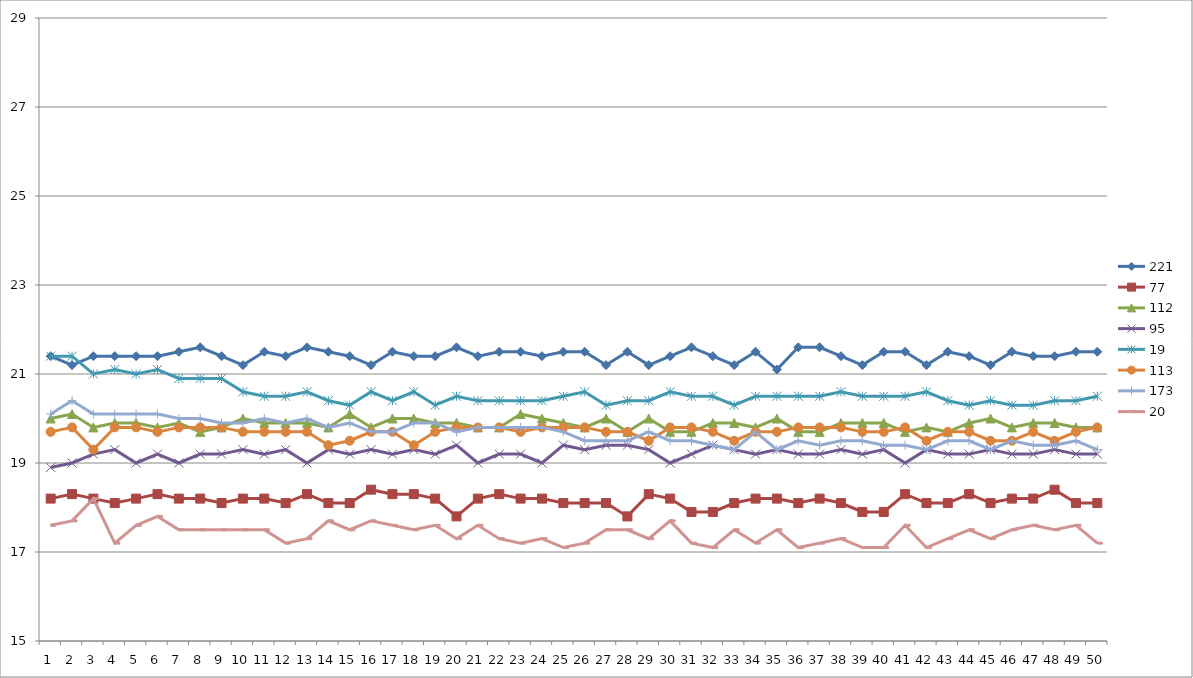
| Category | 221 | 77 | 112 | 95 | 19 | 113 | 173 | 20 |
|---|---|---|---|---|---|---|---|---|
| 0 | 21.4 | 18.2 | 20 | 18.9 | 21.4 | 19.7 | 20.1 | 17.6 |
| 1 | 21.2 | 18.3 | 20.1 | 19 | 21.4 | 19.8 | 20.4 | 17.7 |
| 2 | 21.4 | 18.2 | 19.8 | 19.2 | 21 | 19.3 | 20.1 | 18.2 |
| 3 | 21.4 | 18.1 | 19.9 | 19.3 | 21.1 | 19.8 | 20.1 | 17.2 |
| 4 | 21.4 | 18.2 | 19.9 | 19 | 21 | 19.8 | 20.1 | 17.6 |
| 5 | 21.4 | 18.3 | 19.8 | 19.2 | 21.1 | 19.7 | 20.1 | 17.8 |
| 6 | 21.5 | 18.2 | 19.9 | 19 | 20.9 | 19.8 | 20 | 17.5 |
| 7 | 21.6 | 18.2 | 19.7 | 19.2 | 20.9 | 19.8 | 20 | 17.5 |
| 8 | 21.4 | 18.1 | 19.8 | 19.2 | 20.9 | 19.8 | 19.9 | 17.5 |
| 9 | 21.2 | 18.2 | 20 | 19.3 | 20.6 | 19.7 | 19.9 | 17.5 |
| 10 | 21.5 | 18.2 | 19.9 | 19.2 | 20.5 | 19.7 | 20 | 17.5 |
| 11 | 21.4 | 18.1 | 19.9 | 19.3 | 20.5 | 19.7 | 19.9 | 17.2 |
| 12 | 21.6 | 18.3 | 19.9 | 19 | 20.6 | 19.7 | 20 | 17.3 |
| 13 | 21.5 | 18.1 | 19.8 | 19.3 | 20.4 | 19.4 | 19.8 | 17.7 |
| 14 | 21.4 | 18.1 | 20.1 | 19.2 | 20.3 | 19.5 | 19.9 | 17.5 |
| 15 | 21.2 | 18.4 | 19.8 | 19.3 | 20.6 | 19.7 | 19.7 | 17.7 |
| 16 | 21.5 | 18.3 | 20 | 19.2 | 20.4 | 19.7 | 19.7 | 17.6 |
| 17 | 21.4 | 18.3 | 20 | 19.3 | 20.6 | 19.4 | 19.9 | 17.5 |
| 18 | 21.4 | 18.2 | 19.9 | 19.2 | 20.3 | 19.7 | 19.9 | 17.6 |
| 19 | 21.6 | 17.8 | 19.9 | 19.4 | 20.5 | 19.8 | 19.7 | 17.3 |
| 20 | 21.4 | 18.2 | 19.8 | 19 | 20.4 | 19.8 | 19.8 | 17.6 |
| 21 | 21.5 | 18.3 | 19.8 | 19.2 | 20.4 | 19.8 | 19.8 | 17.3 |
| 22 | 21.5 | 18.2 | 20.1 | 19.2 | 20.4 | 19.7 | 19.8 | 17.2 |
| 23 | 21.4 | 18.2 | 20 | 19 | 20.4 | 19.8 | 19.8 | 17.3 |
| 24 | 21.5 | 18.1 | 19.9 | 19.4 | 20.5 | 19.8 | 19.7 | 17.1 |
| 25 | 21.5 | 18.1 | 19.8 | 19.3 | 20.6 | 19.8 | 19.5 | 17.2 |
| 26 | 21.2 | 18.1 | 20 | 19.4 | 20.3 | 19.7 | 19.5 | 17.5 |
| 27 | 21.5 | 17.8 | 19.7 | 19.4 | 20.4 | 19.7 | 19.5 | 17.5 |
| 28 | 21.2 | 18.3 | 20 | 19.3 | 20.4 | 19.5 | 19.7 | 17.3 |
| 29 | 21.4 | 18.2 | 19.7 | 19 | 20.6 | 19.8 | 19.5 | 17.7 |
| 30 | 21.6 | 17.9 | 19.7 | 19.2 | 20.5 | 19.8 | 19.5 | 17.2 |
| 31 | 21.4 | 17.9 | 19.9 | 19.4 | 20.5 | 19.7 | 19.4 | 17.1 |
| 32 | 21.2 | 18.1 | 19.9 | 19.3 | 20.3 | 19.5 | 19.3 | 17.5 |
| 33 | 21.5 | 18.2 | 19.8 | 19.2 | 20.5 | 19.7 | 19.7 | 17.2 |
| 34 | 21.1 | 18.2 | 20 | 19.3 | 20.5 | 19.7 | 19.3 | 17.5 |
| 35 | 21.6 | 18.1 | 19.7 | 19.2 | 20.5 | 19.8 | 19.5 | 17.1 |
| 36 | 21.6 | 18.2 | 19.7 | 19.2 | 20.5 | 19.8 | 19.4 | 17.2 |
| 37 | 21.4 | 18.1 | 19.9 | 19.3 | 20.6 | 19.8 | 19.5 | 17.3 |
| 38 | 21.2 | 17.9 | 19.9 | 19.2 | 20.5 | 19.7 | 19.5 | 17.1 |
| 39 | 21.5 | 17.9 | 19.9 | 19.3 | 20.5 | 19.7 | 19.4 | 17.1 |
| 40 | 21.5 | 18.3 | 19.7 | 19 | 20.5 | 19.8 | 19.4 | 17.6 |
| 41 | 21.2 | 18.1 | 19.8 | 19.3 | 20.6 | 19.5 | 19.3 | 17.1 |
| 42 | 21.5 | 18.1 | 19.7 | 19.2 | 20.4 | 19.7 | 19.5 | 17.3 |
| 43 | 21.4 | 18.3 | 19.9 | 19.2 | 20.3 | 19.7 | 19.5 | 17.5 |
| 44 | 21.2 | 18.1 | 20 | 19.3 | 20.4 | 19.5 | 19.3 | 17.3 |
| 45 | 21.5 | 18.2 | 19.8 | 19.2 | 20.3 | 19.5 | 19.5 | 17.5 |
| 46 | 21.4 | 18.2 | 19.9 | 19.2 | 20.3 | 19.7 | 19.4 | 17.6 |
| 47 | 21.4 | 18.4 | 19.9 | 19.3 | 20.4 | 19.5 | 19.4 | 17.5 |
| 48 | 21.5 | 18.1 | 19.8 | 19.2 | 20.4 | 19.7 | 19.5 | 17.6 |
| 49 | 21.5 | 18.1 | 19.8 | 19.2 | 20.5 | 19.8 | 19.3 | 17.2 |